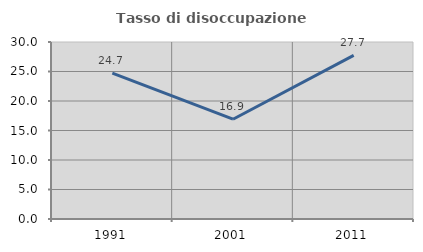
| Category | Tasso di disoccupazione giovanile  |
|---|---|
| 1991.0 | 24.737 |
| 2001.0 | 16.912 |
| 2011.0 | 27.723 |